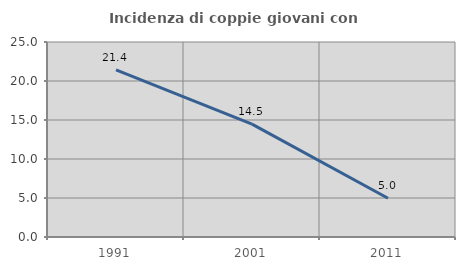
| Category | Incidenza di coppie giovani con figli |
|---|---|
| 1991.0 | 21.429 |
| 2001.0 | 14.474 |
| 2011.0 | 4.975 |